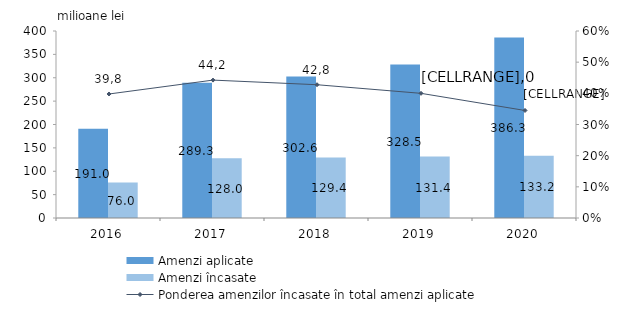
| Category | Amenzi aplicate | Amenzi încasate |
|---|---|---|
| 2016.0 | 191 | 76 |
| 2017.0 | 289.3 | 128 |
| 2018.0 | 302.6 | 129.4 |
| 2019.0 | 328.5 | 131.4 |
| 2020.0 | 386.3 | 133.2 |